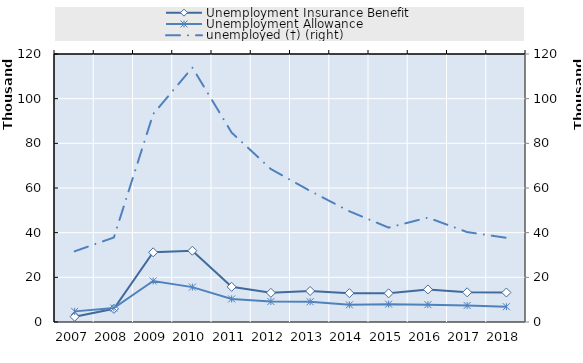
| Category | 0 | Series 14 | Series 15 | Series 16 | Series 17 | Series 18 | Unemployment Insurance Benefit | Unemployment Allowance |
|---|---|---|---|---|---|---|---|---|
| 2007.0 |  |  |  |  |  |  | 2367 | 4757 |
| 2008.0 |  |  |  |  |  |  | 5892 | 6256 |
| 2009.0 |  |  |  |  |  |  | 31207.75 | 18377 |
| 2010.0 |  |  |  |  |  |  | 31922.75 | 15617 |
| 2011.0 |  |  |  |  |  |  | 15744.75 | 10334 |
| 2012.0 |  |  |  |  |  |  | 13059.75 | 9174 |
| 2013.0 |  |  |  |  |  |  | 13885.75 | 9070 |
| 2014.0 |  |  |  |  |  |  | 12910.5 | 7697 |
| 2015.0 |  |  |  |  |  |  | 12849.25 | 7988.667 |
| 2016.0 |  |  |  |  |  |  | 14566.5 | 7767.833 |
| 2017.0 |  |  |  |  |  |  | 13286 | 7396.5 |
| 2018.0 |  |  |  |  |  |  | 13200 | 6845.333 |